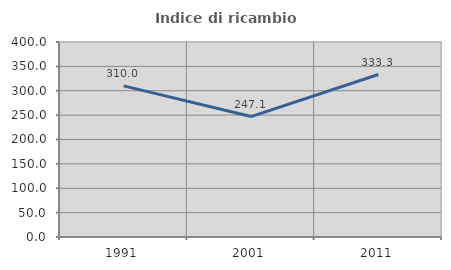
| Category | Indice di ricambio occupazionale  |
|---|---|
| 1991.0 | 310 |
| 2001.0 | 247.059 |
| 2011.0 | 333.333 |